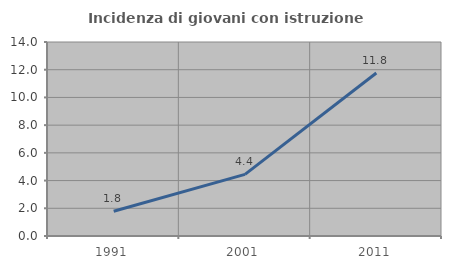
| Category | Incidenza di giovani con istruzione universitaria |
|---|---|
| 1991.0 | 1.786 |
| 2001.0 | 4.444 |
| 2011.0 | 11.765 |